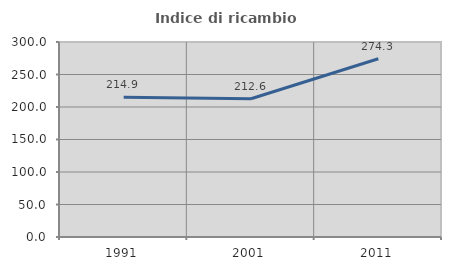
| Category | Indice di ricambio occupazionale  |
|---|---|
| 1991.0 | 214.865 |
| 2001.0 | 212.647 |
| 2011.0 | 274.286 |